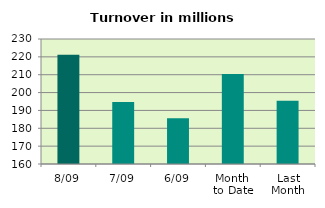
| Category | Series 0 |
|---|---|
| 8/09 | 221.218 |
| 7/09 | 194.673 |
| 6/09 | 185.668 |
| Month 
to Date | 210.389 |
| Last
Month | 195.366 |